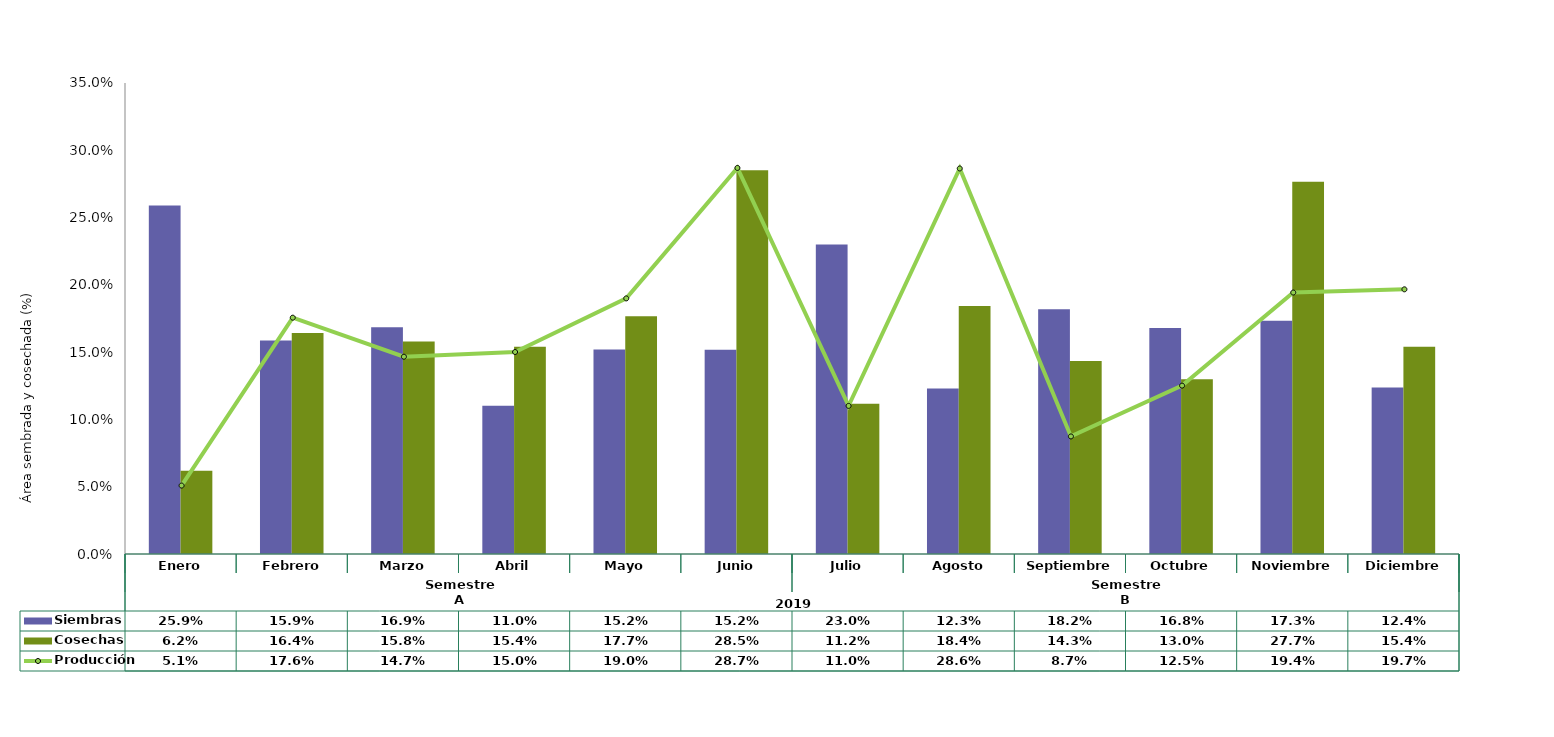
| Category | Siembras | Cosechas   |
|---|---|---|
| 0 | 0.259 | 0.062 |
| 1 | 0.159 | 0.164 |
| 2 | 0.169 | 0.158 |
| 3 | 0.11 | 0.154 |
| 4 | 0.152 | 0.177 |
| 5 | 0.152 | 0.285 |
| 6 | 0.23 | 0.112 |
| 7 | 0.123 | 0.184 |
| 8 | 0.182 | 0.143 |
| 9 | 0.168 | 0.13 |
| 10 | 0.173 | 0.277 |
| 11 | 0.124 | 0.154 |